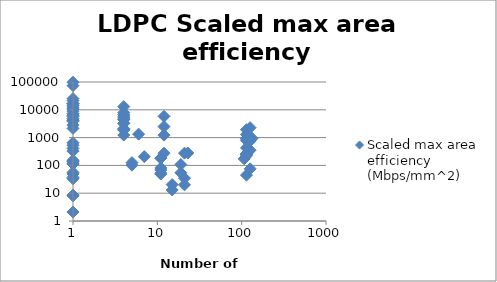
| Category | Scaled max area efficiency (Mbps/mm^2) |
|---|---|
| 107.0 | 172.232 |
| 114.0 | 1922.112 |
| 19.0 | 107.117 |
| 133.0 | 939.406 |
| 114.0 | 44.596 |
| 7.0 | 207.907 |
| 12.0 | 5828.298 |
| 114.0 | 903.636 |
| 114.0 | 249.065 |
| 11.0 | 183.372 |
| 11.0 | 182.372 |
| 11.0 | 80.742 |
| 21.0 | 34.68 |
| 11.0 | 68.306 |
| 11.0 | 48.979 |
| 5.0 | 101.868 |
| 21.0 | 20.016 |
| 15.0 | 20.413 |
| 15.0 | 13.065 |
| 21.0 | 275.96 |
| 11.0 | 52.443 |
| 5.0 | 126.15 |
| 1.0 | 55.794 |
| 12.0 | 274.682 |
| 1.0 | 2142.857 |
| 114.0 | 781.894 |
| 126.0 | 352.538 |
| 126.0 | 75.366 |
| 126.0 | 758.437 |
| 1.0 | 142.047 |
| 126.0 | 2274.336 |
| 1.0 | 36.782 |
| 114.0 | 1291.601 |
| 19.0 | 54.472 |
| 1.0 | 142.047 |
| 1.0 | 530.898 |
| 1.0 | 407.095 |
| 1.0 | 33.096 |
| 1.0 | 325.447 |
| 1.0 | 8.084 |
| 1.0 | 49.103 |
| 1.0 | 152.602 |
| 1.0 | 119.287 |
| 1.0 | 8.586 |
| 1.0 | 111.908 |
| 1.0 | 2.109 |
| 1.0 | 6387.713 |
| 1.0 | 3900.613 |
| 1.0 | 21457.671 |
| 1.0 | 97968.734 |
| 1.0 | 7317.855 |
| 1.0 | 10566.196 |
| 4.0 | 1885.633 |
| 4.0 | 3282.051 |
| 4.0 | 4646.066 |
| 4.0 | 5120.155 |
| 4.0 | 2097.113 |
| 4.0 | 1237.081 |
| 1.0 | 25263.732 |
| 4.0 | 5874.548 |
| 1.0 | 10775.862 |
| 1.0 | 4184.1 |
| 114.0 | 222.442 |
| 12.0 | 2492.667 |
| 23.0 | 279.675 |
| 114.0 | 260.317 |
| 114.0 | 933.333 |
| 1.0 | 12438.563 |
| 1.0 | 16654.064 |
| 1.0 | 16716.667 |
| 1.0 | 8912.096 |
| 1.0 | 5799.402 |
| 6.0 | 1330 |
| 114.0 | 425.977 |
| 114.0 | 261.8 |
| 4.0 | 7874.108 |
| 4.0 | 13070.652 |
| 1.0 | 653.061 |
| 12.0 | 1228.949 |
| 1.0 | 2812.5 |
| 4.0 | 1925 |
| 4.0 | 3247.596 |
| 4.0 | 4431.818 |
| 1.0 | 4265.152 |
| 1.0 | 4853.896 |
| 1.0 | 16130.876 |
| 1.0 | 14137.284 |
| 4.0 | 6627.219 |
| 1.0 | 73789.775 |